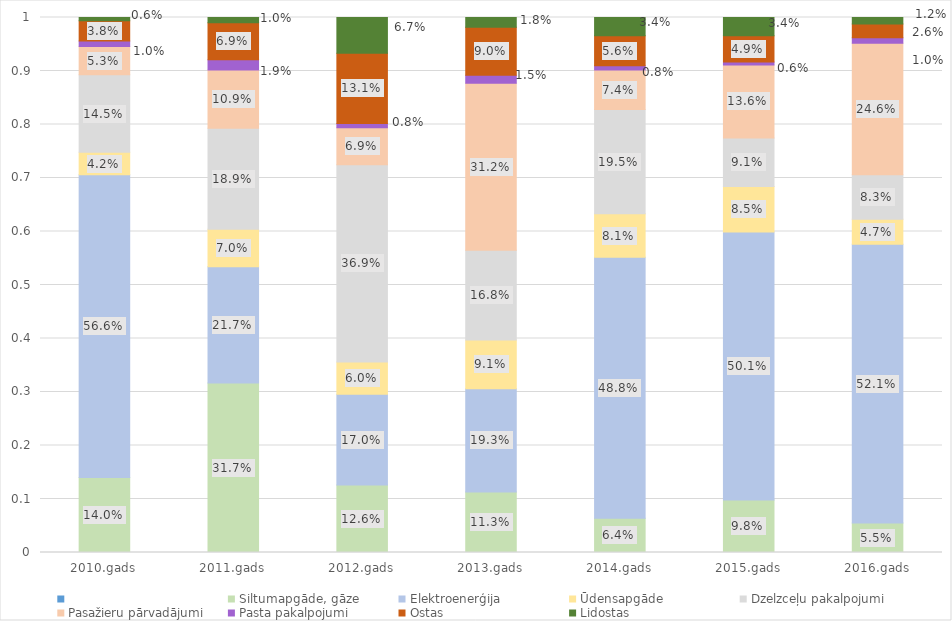
| Category | Series 0 | Siltumapgāde, gāze | Elektroenerģija | Ūdensapgāde | Dzelzceļu pakalpojumi | Pasažieru pārvadājumi | Pasta pakalpojumi | Ostas | Lidostas |
|---|---|---|---|---|---|---|---|---|---|
| 2010.gads |  | 0.14 | 0.566 | 0.042 | 0.145 | 0.053 | 0.01 | 0.038 | 0.006 |
| 2011.gads |  | 0.317 | 0.217 | 0.07 | 0.189 | 0.109 | 0.019 | 0.069 | 0.01 |
| 2012.gads |  | 0.126 | 0.17 | 0.06 | 0.369 | 0.069 | 0.008 | 0.131 | 0.067 |
| 2013.gads |  | 0.113 | 0.193 | 0.091 | 0.168 | 0.312 | 0.015 | 0.09 | 0.018 |
| 2014.gads |  | 0.064 | 0.488 | 0.081 | 0.195 | 0.074 | 0.008 | 0.056 | 0.034 |
| 2015.gads |  | 0.098 | 0.501 | 0.085 | 0.091 | 0.136 | 0.006 | 0.049 | 0.034 |
| 2016.gads |  | 0.055 | 0.521 | 0.047 | 0.083 | 0.246 | 0.01 | 0.026 | 0.012 |